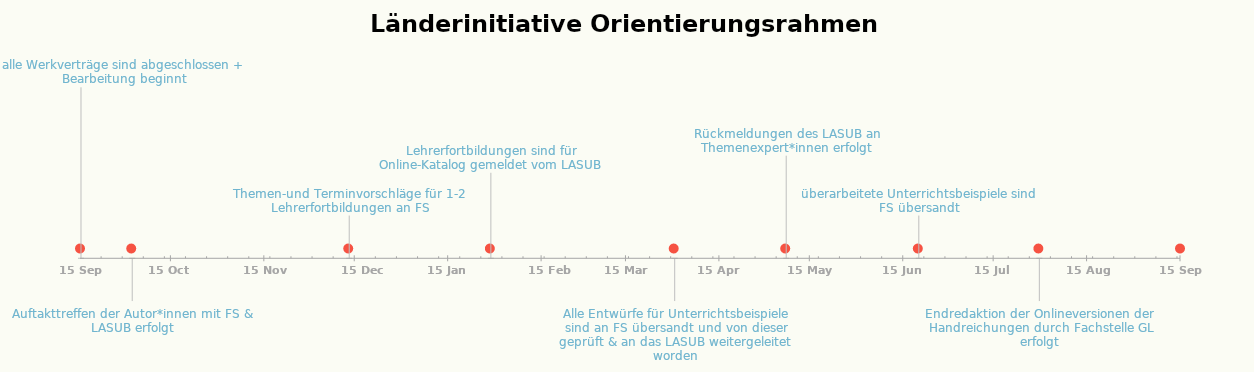
| Category | POSITION |
|---|---|
| alle Werkverträge sind abgeschlossen + Bearbeitung beginnt | 20 |
| Auftakttreffen der Autor*innen mit FS & LASUB erfolgt | -5 |
| Themen-und Terminvorschläge für 1-2 Lehrerfortbildungen an FS | 5 |
| Lehrerfortbildungen sind für Online-Katalog gemeldet vom LASUB | 10 |
| Alle Entwürfe für Unterrichtsbeispiele sind an FS übersandt und von dieser geprüft & an das LASUB weitergeleitet worden | -5 |
| Rückmeldungen des LASUB an Themenexpert*innen erfolgt | 12 |
| überarbeitete Unterrichtsbeispiele sind FS übersandt | 5 |
| Endredaktion der Onlineversionen der Handreichungen durch Fachstelle GL erfolgt | -5 |
| alle Module sind freigegeben, layoutet und online und die Honorare der Autor*innen ausgezahlt | 15 |